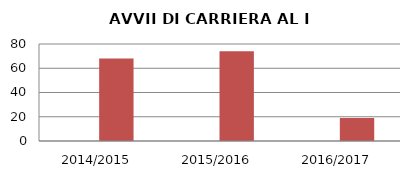
| Category | ANNO | NUMERO |
|---|---|---|
| 2014/2015 | 0 | 68 |
| 2015/2016 | 0 | 74 |
| 2016/2017 | 0 | 19 |